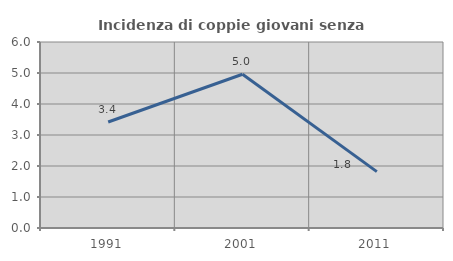
| Category | Incidenza di coppie giovani senza figli |
|---|---|
| 1991.0 | 3.419 |
| 2001.0 | 4.959 |
| 2011.0 | 1.818 |